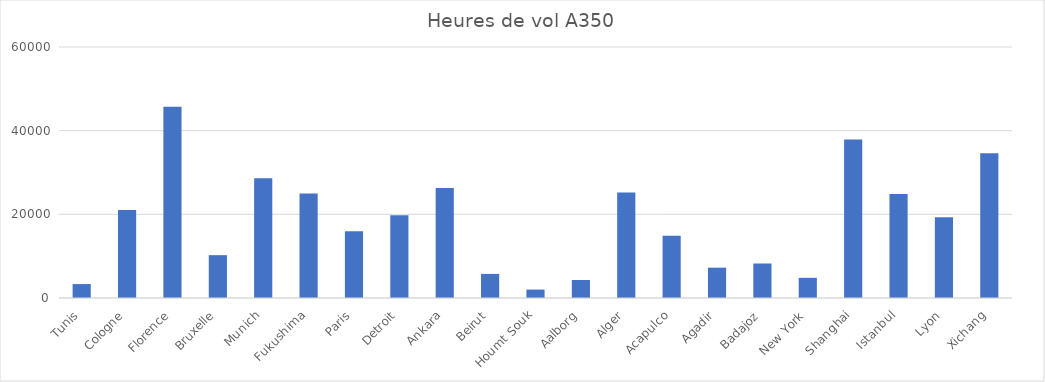
| Category | Heures de vol A350 |
|---|---|
| Tunis | 3330 |
| Cologne | 21050 |
| Florence | 45690 |
| Bruxelle | 10240 |
| Munich | 28610 |
| Fukushima | 24980 |
| Paris | 15970 |
| Detroit | 19760 |
| Ankara | 26320 |
| Beirut | 5760 |
| Houmt Souk | 2010 |
| Aalborg | 4300 |
| Alger | 25200 |
| Acapulco | 14870 |
| Agadir | 7250 |
| Badajoz | 8250 |
| New York | 4822 |
| Shanghai | 37890 |
| Istanbul | 24870 |
| Lyon | 19320 |
| Xichang | 34580 |